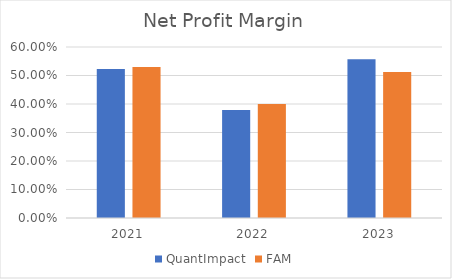
| Category | QuantImpact | FAM |
|---|---|---|
| 2021.0 | 0.523 | 0.53 |
| 2022.0 | 0.379 | 0.4 |
| 2023.0 | 0.557 | 0.512 |